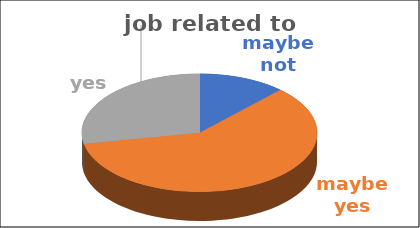
| Category | job related to studies | Series 1 | Series 2 | Series 3 | Series 4 |
|---|---|---|---|---|---|
| maybe not | 0.12 |  |  |  |  |
| maybe yes | 0.6 |  |  |  |  |
| yes | 0.28 |  |  |  |  |